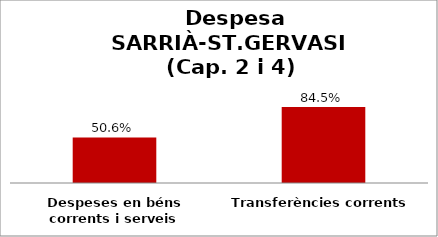
| Category | Series 0 |
|---|---|
| Despeses en béns corrents i serveis | 0.506 |
| Transferències corrents | 0.845 |